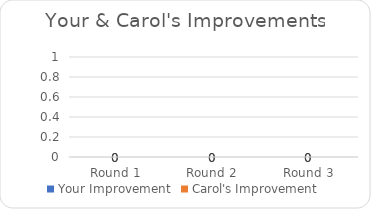
| Category | Your Improvement | Carol's Improvement |
|---|---|---|
| Round 1 | 0 | 0 |
| Round 2 | 0 | 0 |
| Round 3 | 0 | 0 |